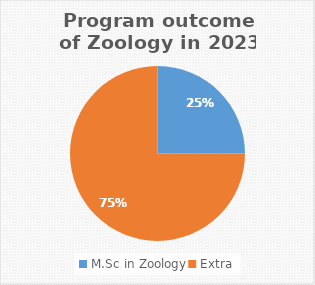
| Category | Series 0 |
|---|---|
| M.Sc in Zoology | 6 |
| Extra | 18 |